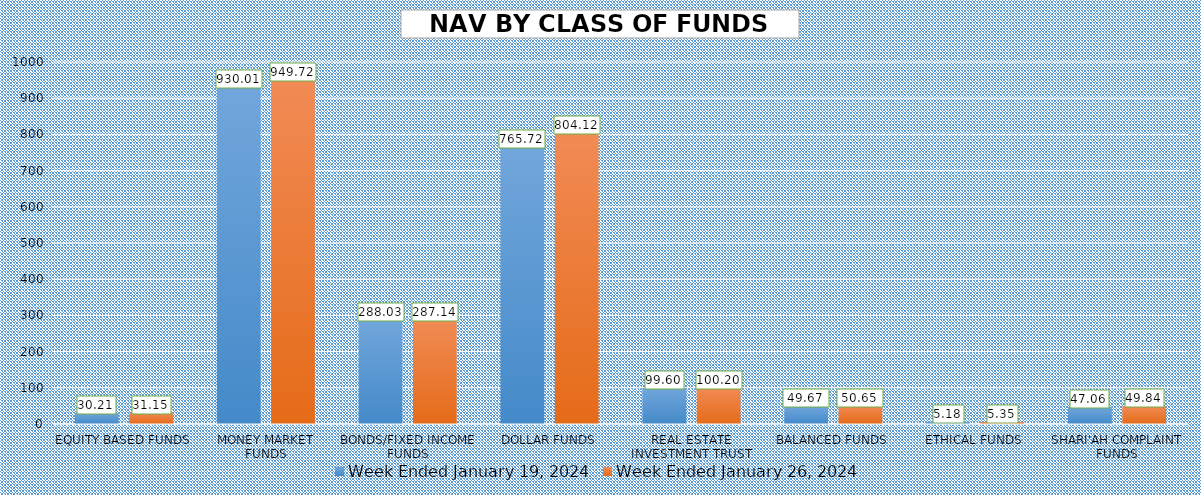
| Category | Week Ended January 19, 2024 | Week Ended January 26, 2024 |
|---|---|---|
| EQUITY BASED FUNDS | 30.207 | 31.15 |
| MONEY MARKET FUNDS | 930.01 | 949.717 |
| BONDS/FIXED INCOME FUNDS | 288.027 | 287.141 |
| DOLLAR FUNDS | 765.723 | 804.117 |
| REAL ESTATE INVESTMENT TRUST | 99.596 | 100.205 |
| BALANCED FUNDS | 49.667 | 50.65 |
| ETHICAL FUNDS | 5.181 | 5.352 |
| SHARI'AH COMPLAINT FUNDS | 47.061 | 49.843 |